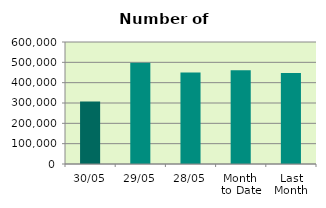
| Category | Series 0 |
|---|---|
| 30/05 | 307860 |
| 29/05 | 497446 |
| 28/05 | 450422 |
| Month 
to Date | 460499.524 |
| Last
Month | 447135.9 |